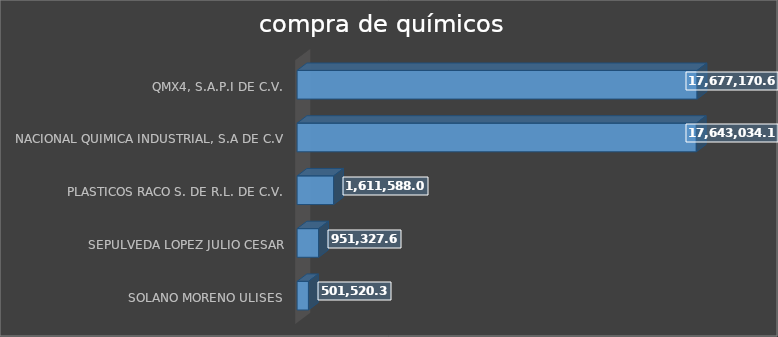
| Category | Suma |
|---|---|
| SOLANO MORENO ULISES | 501520.39 |
| SEPULVEDA LOPEZ JULIO CESAR | 951327.6 |
| PLASTICOS RACO S. DE R.L. DE C.V. | 1611588 |
| NACIONAL QUIMICA INDUSTRIAL, S.A DE C.V | 17643034.16 |
| QMX4, S.A.P.I DE C.V. | 17677170.6 |